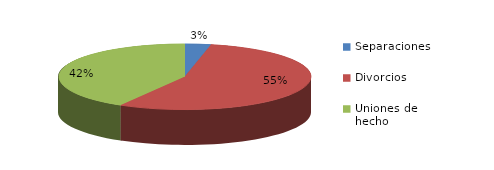
| Category | Series 0 |
|---|---|
| Separaciones | 25 |
| Divorcios | 413 |
| Uniones de hecho | 312 |